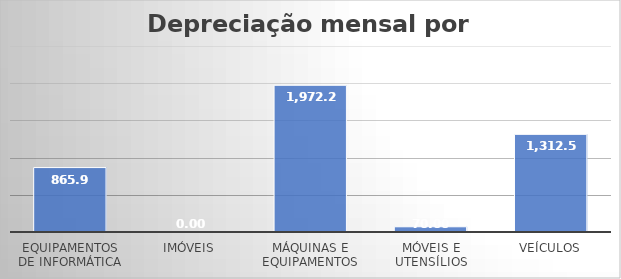
| Category | Total |
|---|---|
| Equipamentos de Informática | 865.972 |
| Imóveis | 0 |
| Máquinas e equipamentos | 1972.222 |
| Móveis e utensílios | 70 |
| Veículos | 1312.5 |